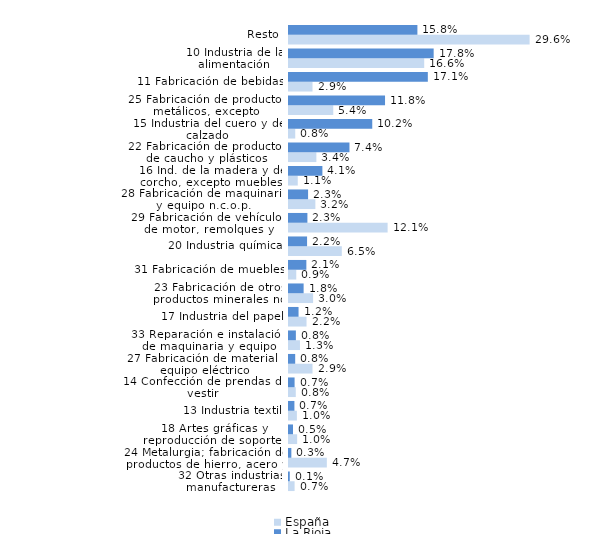
| Category | España | La Rioja |
|---|---|---|
| 32 Otras industrias manufactureras | 0.007 | 0.001 |
| 24 Metalurgia; fabricación de productos de hierro, acero y ferroaleaciones | 0.047 | 0.003 |
| 18 Artes gráficas y reproducción de soportes grabados | 0.01 | 0.005 |
| 13 Industria textil | 0.01 | 0.007 |
| 14 Confección de prendas de vestir | 0.008 | 0.007 |
| 27 Fabricación de material y equipo eléctrico | 0.029 | 0.008 |
| 33 Reparación e instalación de maquinaria y equipo | 0.013 | 0.008 |
| 17 Industria del papel | 0.022 | 0.012 |
| 23 Fabricación de otros productos minerales no metálicos | 0.03 | 0.018 |
| 31 Fabricación de muebles | 0.009 | 0.021 |
| 20 Industria química | 0.065 | 0.022 |
| 29 Fabricación de vehículos de motor, remolques y semirremolques | 0.121 | 0.023 |
| 28 Fabricación de maquinaria y equipo n.c.o.p. | 0.032 | 0.023 |
| 16 Ind. de la madera y del corcho, excepto muebles; cestería y espartería | 0.011 | 0.041 |
| 22 Fabricación de productos de caucho y plásticos | 0.034 | 0.074 |
| 15 Industria del cuero y del calzado | 0.008 | 0.102 |
| 25 Fabricación de productos metálicos, excepto maquinaria y equipo | 0.054 | 0.118 |
| 11 Fabricación de bebidas | 0.029 | 0.171 |
| 10 Industria de la alimentación | 0.166 | 0.178 |
| Resto | 0.296 | 0.158 |